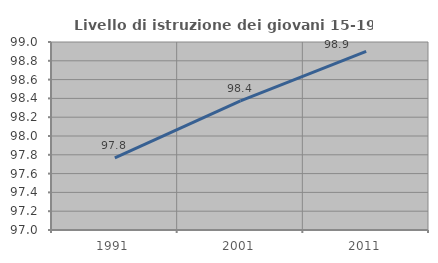
| Category | Livello di istruzione dei giovani 15-19 anni |
|---|---|
| 1991.0 | 97.768 |
| 2001.0 | 98.374 |
| 2011.0 | 98.901 |